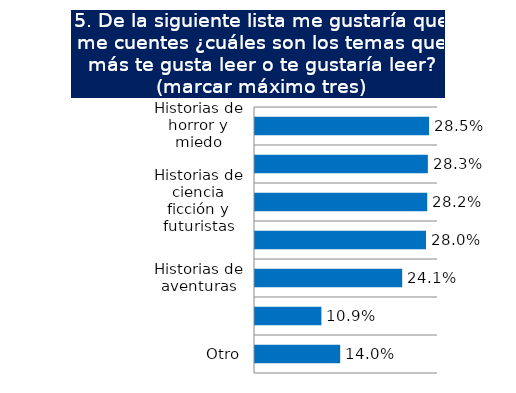
| Category | Series 0 |
|---|---|
| Historias de horror y miedo | 0.285 |
| Historias de magia y misterio | 0.283 |
| Historias de ciencia ficción y futuristas | 0.282 |
| Historias de amor | 0.28 |
| Historias de aventuras | 0.241 |
| Historias de animales | 0.109 |
| Otro | 0.14 |